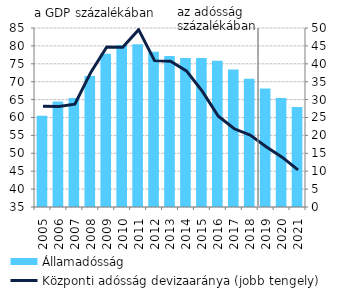
| Category | Államadósság |
|---|---|
| 2005.0 | 60.478 |
| 2006.0 | 64.456 |
| 2007.0 | 65.472 |
| 2008.0 | 71.581 |
| 2009.0 | 77.842 |
| 2010.0 | 80.249 |
| 2011.0 | 80.482 |
| 2012.0 | 78.373 |
| 2013.0 | 77.145 |
| 2014.0 | 76.649 |
| 2015.0 | 76.607 |
| 2016.0 | 75.864 |
| 2017.0 | 73.414 |
| 2018.0 | 70.845 |
| 2019.0 | 68.068 |
| 2020.0 | 65.432 |
| 2021.0 | 62.899 |